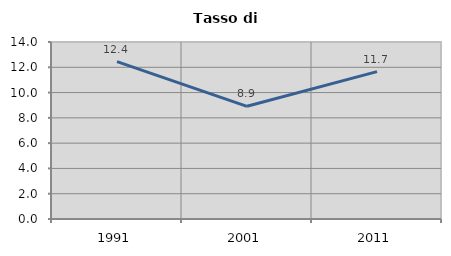
| Category | Tasso di disoccupazione   |
|---|---|
| 1991.0 | 12.443 |
| 2001.0 | 8.913 |
| 2011.0 | 11.659 |